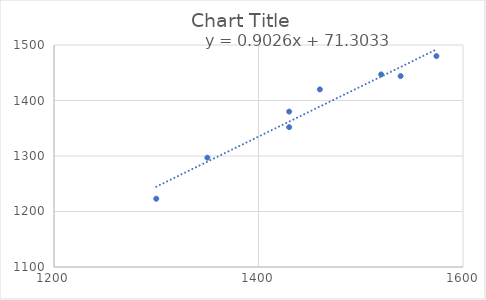
| Category | Series 0 |
|---|---|
| 1574.0 | 1480 |
| 1430.0 | 1352 |
| 1350.0 | 1297 |
| 1539.0 | 1444 |
| 1300.0 | 1223 |
| 1520.0 | 1447 |
| 1430.0 | 1380 |
| 1460.0 | 1420 |